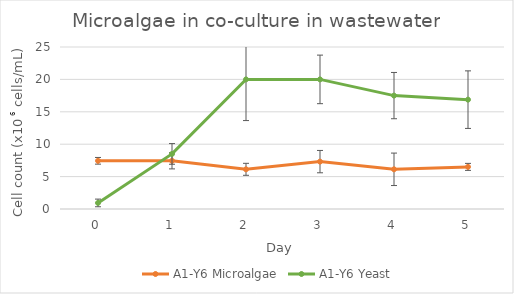
| Category | A1-Y6 Microalgae | A1-Y6 Yeast |
|---|---|---|
| 0.0 | 7.438 | 0.938 |
| 1.0 | 7.438 | 8.5 |
| 2.0 | 6.125 | 20 |
| 3.0 | 7.312 | 20 |
| 4.0 | 6.125 | 17.5 |
| 5.0 | 6.5 | 16.875 |